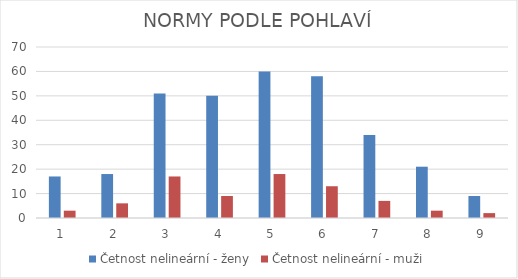
| Category | Četnost nelineární - ženy | Četnost nelineární - muži |
|---|---|---|
| 0 | 17 | 3 |
| 1 | 18 | 6 |
| 2 | 51 | 17 |
| 3 | 50 | 9 |
| 4 | 60 | 18 |
| 5 | 58 | 13 |
| 6 | 34 | 7 |
| 7 | 21 | 3 |
| 8 | 9 | 2 |